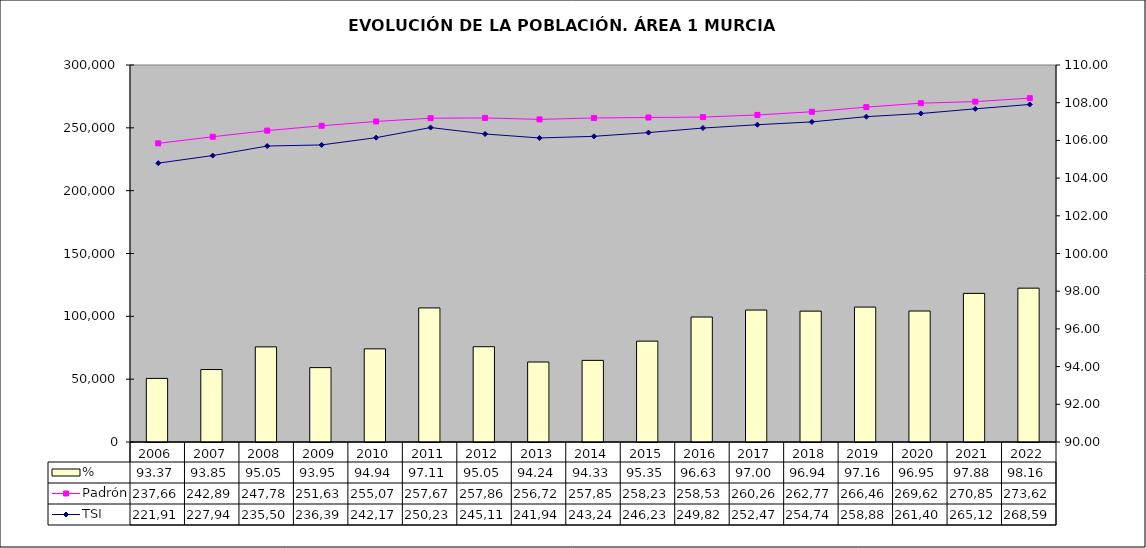
| Category | % |
|---|---|
| 2006.0 | 93.373 |
| 2007.0 | 93.845 |
| 2008.0 | 95.046 |
| 2009.0 | 93.946 |
| 2010.0 | 94.942 |
| 2011.0 | 97.112 |
| 2012.0 | 95.055 |
| 2013.0 | 94.242 |
| 2014.0 | 94.33 |
| 2015.0 | 95.35 |
| 2016.0 | 96.63 |
| 2017.0 | 97 |
| 2018.0 | 96.942 |
| 2019.0 | 97.158 |
| 2020.0 | 96.949 |
| 2021.0 | 97.883 |
| 2022.0 | 98.161 |